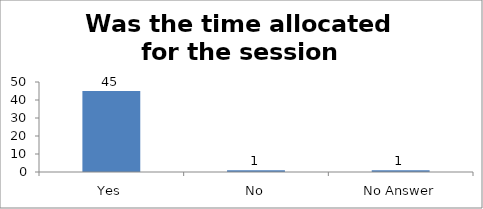
| Category | Was the time allocated for the session sufficient? |
|---|---|
| Yes | 45 |
| No | 1 |
| No Answer | 1 |